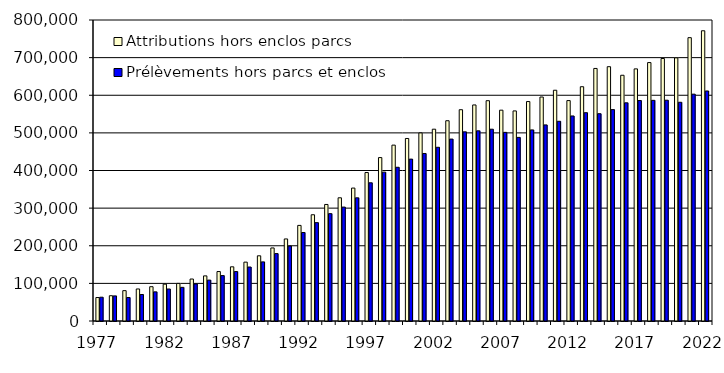
| Category | Attributions hors enclos parcs | Prélèvements hors parcs et enclos |
|---|---|---|
| 1977.0 | 62379 | 63220 |
| 1978.0 | 67191 | 66692 |
| 1979.0 | 80653 | 62487 |
| 1980.0 | 85170 | 70397 |
| 1981.0 | 91166 | 77466 |
| 1982.0 | 97920 | 85044 |
| 1983.0 | 99956 | 89443 |
| 1984.0 | 111585 | 98445 |
| 1985.0 | 119910 | 108687 |
| 1986.0 | 131458 | 120707 |
| 1987.0 | 144008 | 131368 |
| 1988.0 | 156478 | 143476 |
| 1989.0 | 173277 | 157076 |
| 1990.0 | 194167 | 179166 |
| 1991.0 | 218084 | 199325 |
| 1992.0 | 254096 | 235215 |
| 1993.0 | 282351 | 261418 |
| 1994.0 | 309727 | 285319 |
| 1995.0 | 327481 | 302744 |
| 1996.0 | 353297 | 327403 |
| 1997.0 | 394574 | 367288 |
| 1998.0 | 434305 | 395657 |
| 1999.0 | 467460 | 408592 |
| 2000.0 | 485117 | 430262 |
| 2001.0 | 499874 | 445248 |
| 2002.0 | 509796 | 461689 |
| 2003.0 | 532299 | 483513 |
| 2004.0 | 561575 | 502771 |
| 2005.0 | 574237 | 505443 |
| 2006.0 | 585520 | 509726 |
| 2007.0 | 560332 | 501345 |
| 2008.0 | 558349 | 487984 |
| 2009.0 | 583242 | 507898 |
| 2010.0 | 595342 | 521188 |
| 2011.0 | 613300 | 530805 |
| 2012.0 | 585803 | 544960 |
| 2013.0 | 622641 | 553632 |
| 2014.0 | 671247 | 550959 |
| 2015.0 | 675898 | 561858 |
| 2016.0 | 653152 | 579880 |
| 2017.0 | 670088 | 585951 |
| 2018.0 | 686837 | 586464 |
| 2019.0 | 697690 | 586797 |
| 2020.0 | 699377 | 581325 |
| 2021.0 | 753056 | 602866 |
| 2022.0 | 771369 | 611355 |